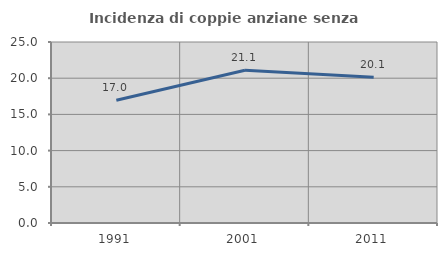
| Category | Incidenza di coppie anziane senza figli  |
|---|---|
| 1991.0 | 16.953 |
| 2001.0 | 21.094 |
| 2011.0 | 20.118 |